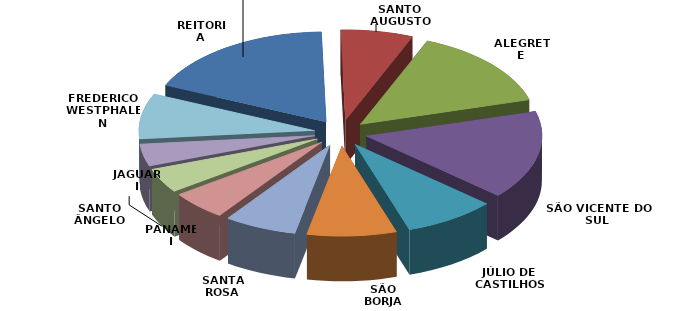
| Category | Series 0 | Series 1 |
|---|---|---|
| REITORIA | 3801554.54 | 0.179 |
| SANTO AUGUSTO | 1411719.64 | 0.066 |
| ALEGRETE | 3051202.54 | 0.144 |
| SÃO VICENTE DO SUL | 3376499.99 | 0.159 |
| JÚLIO DE CASTILHOS | 1800495.8 | 0.085 |
| SÃO BORJA | 1745361.89 | 0.082 |
| SANTA ROSA | 1415607.66 | 0.067 |
| PANAMBI | 1110502.99 | 0.052 |
| JAGUARI | 932263.52 | 0.044 |
| SANTO ÂNGELO | 849140.88 | 0.04 |
| FREDERICO WESTPHALEN | 1734707.49 | 0.082 |